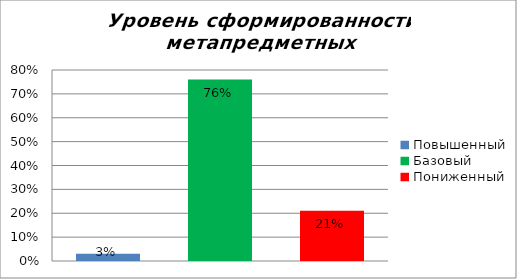
| Category | Уровень сформированности метапредметных результатов |
|---|---|
| Повышенный | 0.03 |
| Базовый | 0.76 |
| Пониженный | 0.21 |